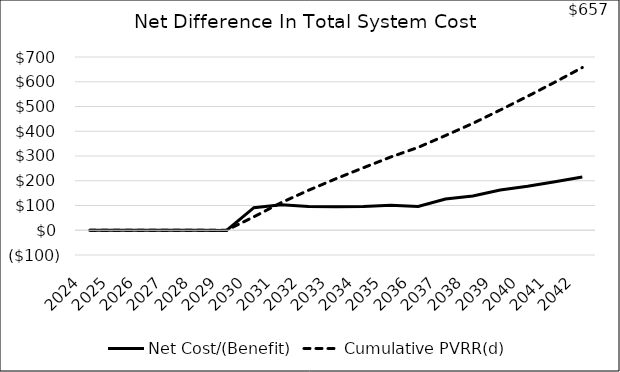
| Category | Net Cost/(Benefit) | Cumulative PVRR(d) |
|---|---|---|
| 2024.0 | 0 | 0.006 |
| 2025.0 | -0.005 | 0.001 |
| 2026.0 | 0.351 | 0.273 |
| 2027.0 | 0 | 0.273 |
| 2028.0 | -0.004 | 0.27 |
| 2029.0 | -0.525 | -0.063 |
| 2030.0 | 91.379 | 54.369 |
| 2031.0 | 102.633 | 111.672 |
| 2032.0 | 95.518 | 161.658 |
| 2033.0 | 95.107 | 208.307 |
| 2034.0 | 96.09 | 252.484 |
| 2035.0 | 100.826 | 295.931 |
| 2036.0 | 96.218 | 334.793 |
| 2037.0 | 126.375 | 382.635 |
| 2038.0 | 138.452 | 431.762 |
| 2039.0 | 162.397 | 485.772 |
| 2040.0 | 177.546 | 541.118 |
| 2041.0 | 196.132 | 598.423 |
| 2042.0 | 215.483 | 657.435 |